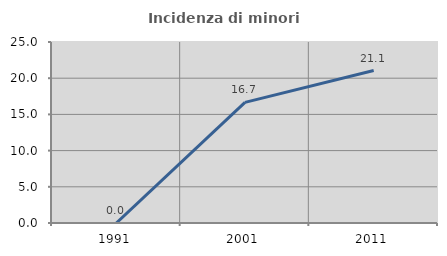
| Category | Incidenza di minori stranieri |
|---|---|
| 1991.0 | 0 |
| 2001.0 | 16.667 |
| 2011.0 | 21.053 |